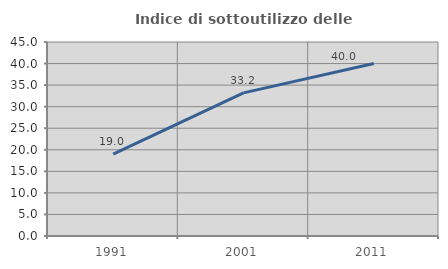
| Category | Indice di sottoutilizzo delle abitazioni  |
|---|---|
| 1991.0 | 18.987 |
| 2001.0 | 33.195 |
| 2011.0 | 40 |